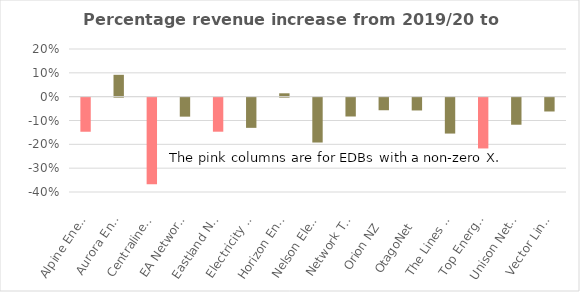
| Category | Series 0 |
|---|---|
|  Alpine Energy  | -0.143 |
|  Aurora Energy  | 0.092 |
|  Centralines  | -0.363 |
|  EA Networks  | -0.08 |
|  Eastland Network  | -0.143 |
|  Electricity Invercargill  | -0.127 |
|  Horizon Energy  | 0.014 |
|  Nelson Electricity  | -0.188 |
|  Network Tasman  | -0.079 |
|  Orion NZ  | -0.053 |
|  OtagoNet  | -0.054 |
|  The Lines Company  | -0.151 |
|  Top Energy  | -0.213 |
|  Unison Networks  | -0.114 |
|  Vector Lines  | -0.058 |